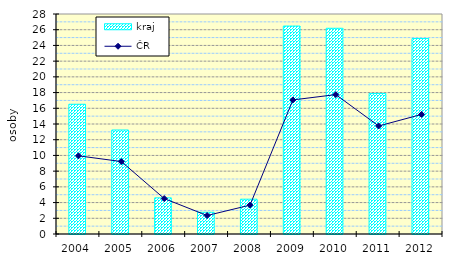
| Category | kraj |
|---|---|
| 2004.0 | 16.514 |
| 2005.0 | 13.237 |
| 2006.0 | 4.599 |
| 2007.0 | 2.771 |
| 2008.0 | 4.429 |
| 2009.0 | 26.466 |
| 2010.0 | 26.182 |
| 2011.0 | 17.89 |
| 2012.0 | 24.875 |